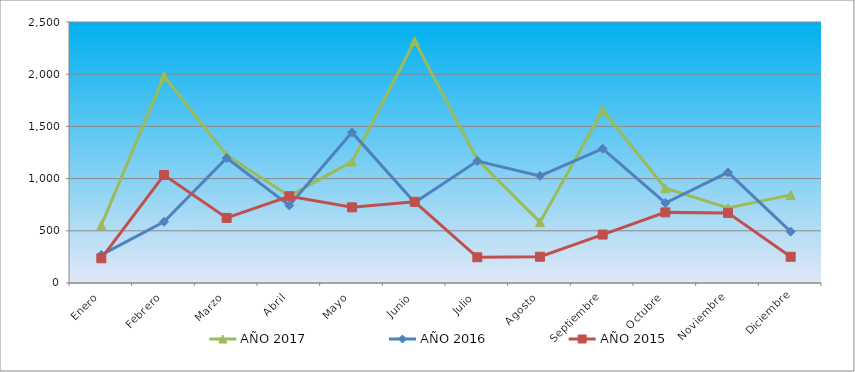
| Category | AÑO 2017 | AÑO 2016 | AÑO 2015 |
|---|---|---|---|
| Enero | 553.983 | 269.621 | 236.769 |
| Febrero | 1980.812 | 586.544 | 1034.052 |
| Marzo | 1223.916 | 1196.739 | 623.33 |
| Abril | 834.196 | 742.641 | 831.107 |
| Mayo | 1162.72 | 1442.71 | 724.803 |
| Junio | 2318.999 | 771.022 | 777.955 |
| Julio | 1182.045 | 1168.358 | 246.433 |
| Agosto | 582.971 | 1026.452 | 251.265 |
| Septiembre | 1655.508 | 1286.613 | 463.874 |
| Octubre | 908.275 | 766.292 | 676.483 |
| Noviembre | 718.246 | 1059.564 | 671.651 |
| Diciembre | 843.858 | 491.94 | 251.265 |